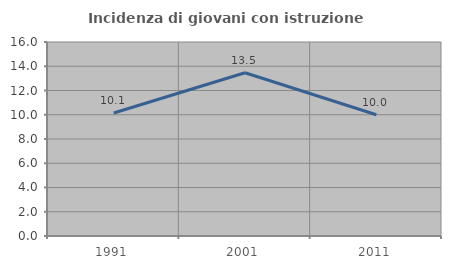
| Category | Incidenza di giovani con istruzione universitaria |
|---|---|
| 1991.0 | 10.145 |
| 2001.0 | 13.462 |
| 2011.0 | 10 |